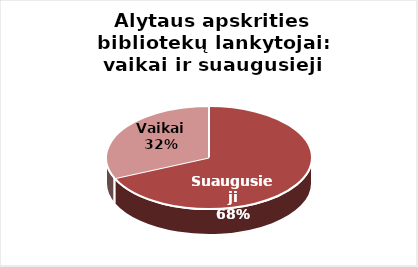
| Category | Series 0 |
|---|---|
| Suaugusieji | 289379 |
| Vaikai | 133444 |